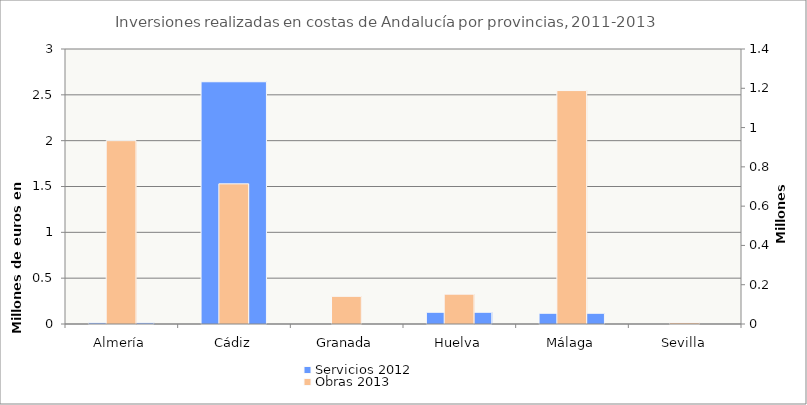
| Category | Servicios 2012 |
|---|---|
| Almería | 13601 |
| Cádiz | 2642630 |
| Granada | 0 |
| Huelva | 127999 |
| Málaga | 117051 |
| Sevilla | 0 |